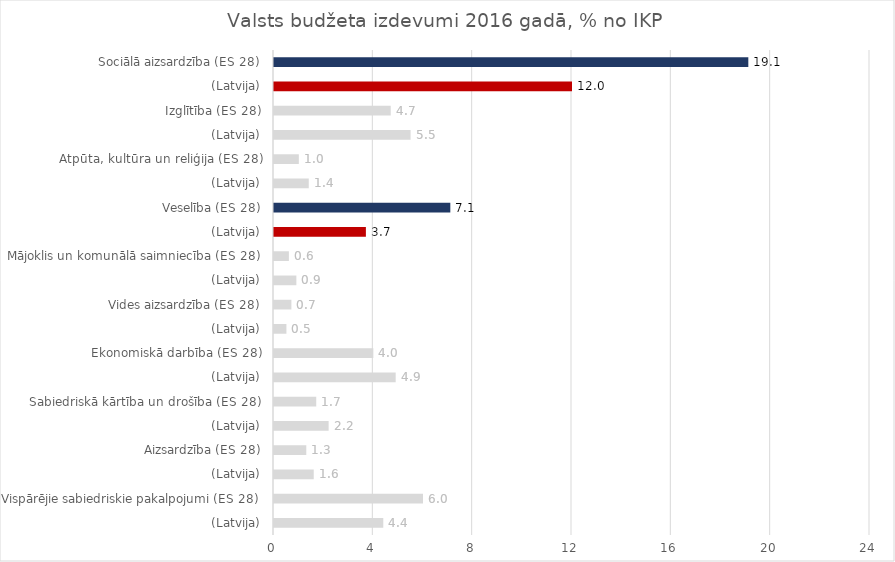
| Category | 2016 |
|---|---|
| (Latvija) | 4.4 |
| Vispārējie sabiedriskie pakalpojumi (ES 28) | 6 |
| (Latvija) | 1.6 |
| Aizsardzība (ES 28) | 1.3 |
| (Latvija) | 2.2 |
| Sabiedriskā kārtība un drošība (ES 28) | 1.7 |
| (Latvija) | 4.9 |
| Ekonomiskā darbība (ES 28) | 4 |
| (Latvija) | 0.5 |
| Vides aizsardzība (ES 28) | 0.7 |
| (Latvija) | 0.9 |
| Mājoklis un komunālā saimniecība (ES 28) | 0.6 |
| (Latvija) | 3.7 |
| Veselība (ES 28) | 7.1 |
| (Latvija) | 1.4 |
| Atpūta, kultūra un reliģija (ES 28) | 1 |
| (Latvija) | 5.5 |
| Izglītība (ES 28) | 4.7 |
| (Latvija) | 12 |
| Sociālā aizsardzība (ES 28) | 19.1 |